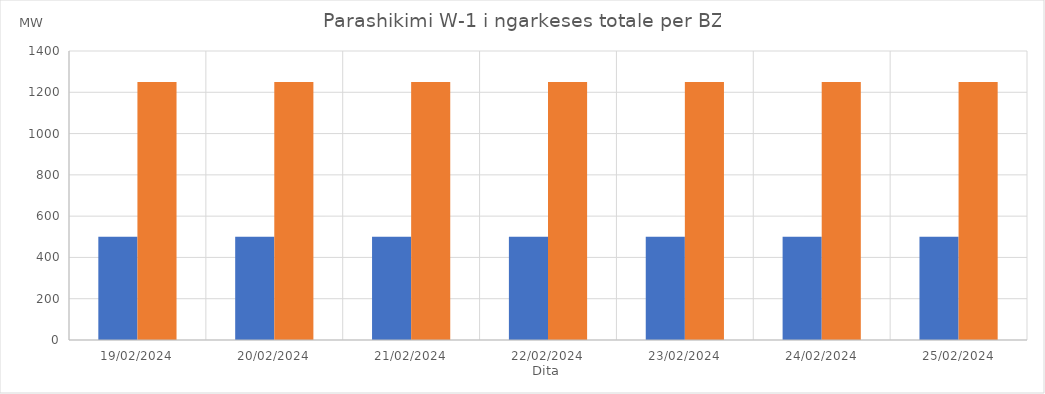
| Category | Min (MW) | Max (MW) |
|---|---|---|
| 19/02/2024 | 500 | 1250 |
| 20/02/2024 | 500 | 1250 |
| 21/02/2024 | 500 | 1250 |
| 22/02/2024 | 500 | 1250 |
| 23/02/2024 | 500 | 1250 |
| 24/02/2024 | 500 | 1250 |
| 25/02/2024 | 500 | 1250 |